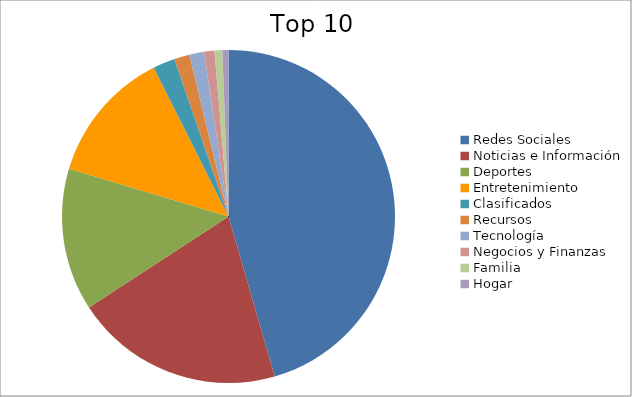
| Category | Series 0 |
|---|---|
| Redes Sociales | 44.44 |
| Noticias e Información | 19.8 |
| Deportes | 13.49 |
| Entretenimiento | 12.65 |
| Clasificados | 2.1 |
| Recursos | 1.45 |
| Tecnología | 1.4 |
| Negocios y Finanzas | 0.98 |
| Familia | 0.73 |
| Hogar | 0.58 |